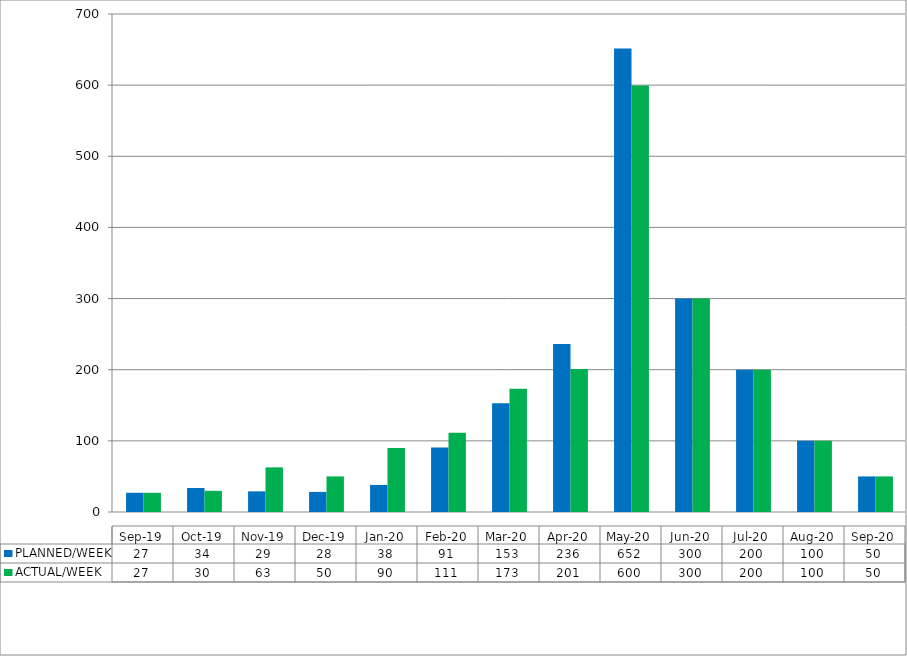
| Category | PLANNED/WEEK | ACTUAL/WEEK |
|---|---|---|
| 2019-09-15 | 27 | 27 |
| 2019-10-20 | 33.75 | 29.75 |
| 2019-11-19 | 29 | 62.75 |
| 2019-12-19 | 28.25 | 50 |
| 2020-01-20 | 38 | 90 |
| 2020-02-20 | 90.6 | 111.4 |
| 2020-03-01 | 152.75 | 173.25 |
| 2020-04-01 | 236.25 | 201 |
| 2020-05-01 | 651.5 | 599.5 |
| 2020-06-01 | 300 | 300 |
| 2020-07-01 | 200 | 200 |
| 2020-08-01 | 100 | 100 |
| 2020-09-01 | 50 | 50 |